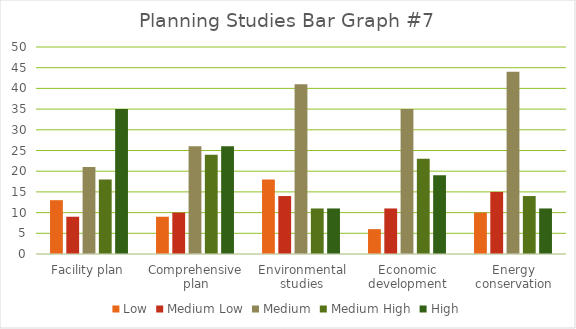
| Category | Low | Medium Low | Medium | Medium High | High |
|---|---|---|---|---|---|
| Facility plan | 13 | 9 | 21 | 18 | 35 |
| Comprehensive plan | 9 | 10 | 26 | 24 | 26 |
| Environmental studies | 18 | 14 | 41 | 11 | 11 |
| Economic development | 6 | 11 | 35 | 23 | 19 |
| Energy conservation | 10 | 15 | 44 | 14 | 11 |